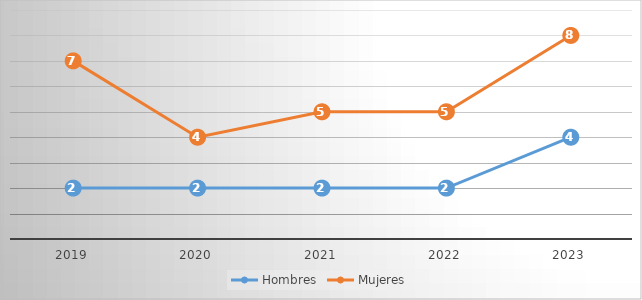
| Category | Hombres | Mujeres |
|---|---|---|
| 2019.0 | 2 | 7 |
| 2020.0 | 2 | 4 |
| 2021.0 | 2 | 5 |
| 2022.0 | 2 | 5 |
| 2023.0 | 4 | 8 |